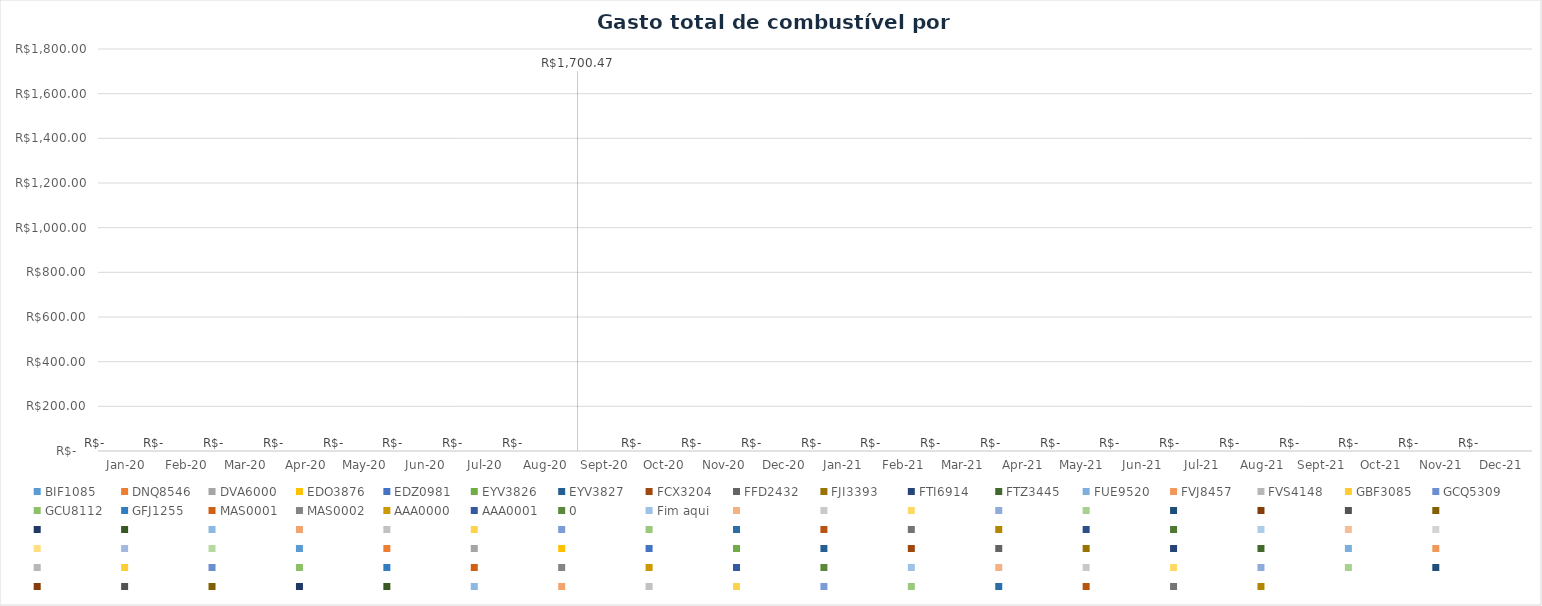
| Category | BIF1085 | DNQ8546 | DVA6000 | EDO3876 | EDZ0981 | EYV3826 | EYV3827 | FCX3204 | FFD2432 | FJI3393 | FTI6914 | FTZ3445 | FUE9520 | FVJ8457 | FVS4148 | GBF3085 | GCQ5309 | GCU8112 | GFJ1255 | MAS0001 | MAS0002 | AAA0000 | AAA0001 | 0 | Fim aqui | Series 25 | Series 26 | Series 27 | Series 28 | Series 29 | Series 30 | Series 31 | Series 32 | Series 33 | Series 34 | Series 35 | Series 36 | Series 37 | Series 38 | Series 39 | Series 40 | Series 41 | Series 42 | Series 43 | Series 44 | Series 45 | Series 46 | Series 47 | Series 48 | Series 49 | Series 50 | Series 51 | Series 52 | Series 53 | Series 54 | Series 55 | Series 56 | Series 57 | Series 58 | Series 59 | Series 60 | Series 61 | Series 62 | Series 63 | Series 64 | Series 65 | Series 66 | Series 67 | Series 68 | Series 69 | Series 70 | Series 71 | Series 72 | Series 73 | Series 74 | Series 75 | Series 76 | Series 77 | Series 78 | Series 79 | Series 80 | Series 81 | Series 82 | Series 83 | Series 84 | Series 85 | Series 86 | Series 87 | Series 88 | Series 89 | Series 90 | Series 91 | Series 92 | Series 93 | Series 94 | Series 95 | Series 96 | Series 97 | Series 98 | Series 99 |
|---|---|---|---|---|---|---|---|---|---|---|---|---|---|---|---|---|---|---|---|---|---|---|---|---|---|---|---|---|---|---|---|---|---|---|---|---|---|---|---|---|---|---|---|---|---|---|---|---|---|---|---|---|---|---|---|---|---|---|---|---|---|---|---|---|---|---|---|---|---|---|---|---|---|---|---|---|---|---|---|---|---|---|---|---|---|---|---|---|---|---|---|---|---|---|---|---|---|---|---|---|
| 2020-01-01 | 0 | 0 | 0 | 0 | 0 | 0 | 0 | 0 | 0 | 0 | 0 | 0 | 0 | 0 | 0 | 0 | 0 | 0 | 0 | 0 | 0 | 0 | 0 | 0 | 0 | 0 | 0 | 0 | 0 | 0 | 0 | 0 | 0 | 0 | 0 | 0 | 0 | 0 | 0 | 0 | 0 | 0 | 0 | 0 | 0 | 0 | 0 | 0 | 0 | 0 | 0 | 0 | 0 | 0 | 0 | 0 | 0 | 0 | 0 | 0 | 0 | 0 | 0 | 0 | 0 | 0 | 0 | 0 | 0 | 0 | 0 | 0 | 0 | 0 | 0 | 0 | 0 | 0 | 0 | 0 | 0 | 0 | 0 | 0 | 0 | 0 | 0 | 0 | 0 | 0 | 0 | 0 | 0 | 0 | 0 | 0 | 0 | 0 | 0 | 0 |
| 2020-02-01 | 0 | 0 | 0 | 0 | 0 | 0 | 0 | 0 | 0 | 0 | 0 | 0 | 0 | 0 | 0 | 0 | 0 | 0 | 0 | 0 | 0 | 0 | 0 | 0 | 0 | 0 | 0 | 0 | 0 | 0 | 0 | 0 | 0 | 0 | 0 | 0 | 0 | 0 | 0 | 0 | 0 | 0 | 0 | 0 | 0 | 0 | 0 | 0 | 0 | 0 | 0 | 0 | 0 | 0 | 0 | 0 | 0 | 0 | 0 | 0 | 0 | 0 | 0 | 0 | 0 | 0 | 0 | 0 | 0 | 0 | 0 | 0 | 0 | 0 | 0 | 0 | 0 | 0 | 0 | 0 | 0 | 0 | 0 | 0 | 0 | 0 | 0 | 0 | 0 | 0 | 0 | 0 | 0 | 0 | 0 | 0 | 0 | 0 | 0 | 0 |
| 2020-03-01 | 0 | 0 | 0 | 0 | 0 | 0 | 0 | 0 | 0 | 0 | 0 | 0 | 0 | 0 | 0 | 0 | 0 | 0 | 0 | 0 | 0 | 0 | 0 | 0 | 0 | 0 | 0 | 0 | 0 | 0 | 0 | 0 | 0 | 0 | 0 | 0 | 0 | 0 | 0 | 0 | 0 | 0 | 0 | 0 | 0 | 0 | 0 | 0 | 0 | 0 | 0 | 0 | 0 | 0 | 0 | 0 | 0 | 0 | 0 | 0 | 0 | 0 | 0 | 0 | 0 | 0 | 0 | 0 | 0 | 0 | 0 | 0 | 0 | 0 | 0 | 0 | 0 | 0 | 0 | 0 | 0 | 0 | 0 | 0 | 0 | 0 | 0 | 0 | 0 | 0 | 0 | 0 | 0 | 0 | 0 | 0 | 0 | 0 | 0 | 0 |
| 2020-04-01 | 0 | 0 | 0 | 0 | 0 | 0 | 0 | 0 | 0 | 0 | 0 | 0 | 0 | 0 | 0 | 0 | 0 | 0 | 0 | 0 | 0 | 0 | 0 | 0 | 0 | 0 | 0 | 0 | 0 | 0 | 0 | 0 | 0 | 0 | 0 | 0 | 0 | 0 | 0 | 0 | 0 | 0 | 0 | 0 | 0 | 0 | 0 | 0 | 0 | 0 | 0 | 0 | 0 | 0 | 0 | 0 | 0 | 0 | 0 | 0 | 0 | 0 | 0 | 0 | 0 | 0 | 0 | 0 | 0 | 0 | 0 | 0 | 0 | 0 | 0 | 0 | 0 | 0 | 0 | 0 | 0 | 0 | 0 | 0 | 0 | 0 | 0 | 0 | 0 | 0 | 0 | 0 | 0 | 0 | 0 | 0 | 0 | 0 | 0 | 0 |
| 2020-05-01 | 0 | 0 | 0 | 0 | 0 | 0 | 0 | 0 | 0 | 0 | 0 | 0 | 0 | 0 | 0 | 0 | 0 | 0 | 0 | 0 | 0 | 0 | 0 | 0 | 0 | 0 | 0 | 0 | 0 | 0 | 0 | 0 | 0 | 0 | 0 | 0 | 0 | 0 | 0 | 0 | 0 | 0 | 0 | 0 | 0 | 0 | 0 | 0 | 0 | 0 | 0 | 0 | 0 | 0 | 0 | 0 | 0 | 0 | 0 | 0 | 0 | 0 | 0 | 0 | 0 | 0 | 0 | 0 | 0 | 0 | 0 | 0 | 0 | 0 | 0 | 0 | 0 | 0 | 0 | 0 | 0 | 0 | 0 | 0 | 0 | 0 | 0 | 0 | 0 | 0 | 0 | 0 | 0 | 0 | 0 | 0 | 0 | 0 | 0 | 0 |
| 2020-06-01 | 0 | 0 | 0 | 0 | 0 | 0 | 0 | 0 | 0 | 0 | 0 | 0 | 0 | 0 | 0 | 0 | 0 | 0 | 0 | 0 | 0 | 0 | 0 | 0 | 0 | 0 | 0 | 0 | 0 | 0 | 0 | 0 | 0 | 0 | 0 | 0 | 0 | 0 | 0 | 0 | 0 | 0 | 0 | 0 | 0 | 0 | 0 | 0 | 0 | 0 | 0 | 0 | 0 | 0 | 0 | 0 | 0 | 0 | 0 | 0 | 0 | 0 | 0 | 0 | 0 | 0 | 0 | 0 | 0 | 0 | 0 | 0 | 0 | 0 | 0 | 0 | 0 | 0 | 0 | 0 | 0 | 0 | 0 | 0 | 0 | 0 | 0 | 0 | 0 | 0 | 0 | 0 | 0 | 0 | 0 | 0 | 0 | 0 | 0 | 0 |
| 2020-07-01 | 0 | 0 | 0 | 0 | 0 | 0 | 0 | 0 | 0 | 0 | 0 | 0 | 0 | 0 | 0 | 0 | 0 | 0 | 0 | 0 | 0 | 0 | 0 | 0 | 0 | 0 | 0 | 0 | 0 | 0 | 0 | 0 | 0 | 0 | 0 | 0 | 0 | 0 | 0 | 0 | 0 | 0 | 0 | 0 | 0 | 0 | 0 | 0 | 0 | 0 | 0 | 0 | 0 | 0 | 0 | 0 | 0 | 0 | 0 | 0 | 0 | 0 | 0 | 0 | 0 | 0 | 0 | 0 | 0 | 0 | 0 | 0 | 0 | 0 | 0 | 0 | 0 | 0 | 0 | 0 | 0 | 0 | 0 | 0 | 0 | 0 | 0 | 0 | 0 | 0 | 0 | 0 | 0 | 0 | 0 | 0 | 0 | 0 | 0 | 0 |
| 2020-08-01 | 0 | 0 | 0 | 0 | 0 | 0 | 0 | 0 | 0 | 0 | 0 | 0 | 0 | 0 | 0 | 0 | 0 | 0 | 0 | 0 | 0 | 0 | 0 | 0 | 0 | 0 | 0 | 0 | 0 | 0 | 0 | 0 | 0 | 0 | 0 | 0 | 0 | 0 | 0 | 0 | 0 | 0 | 0 | 0 | 0 | 0 | 0 | 0 | 0 | 0 | 0 | 0 | 0 | 0 | 0 | 0 | 0 | 0 | 0 | 0 | 0 | 0 | 0 | 0 | 0 | 0 | 0 | 0 | 0 | 0 | 0 | 0 | 0 | 0 | 0 | 0 | 0 | 0 | 0 | 0 | 0 | 0 | 0 | 0 | 0 | 0 | 0 | 0 | 0 | 0 | 0 | 0 | 0 | 0 | 0 | 0 | 0 | 0 | 0 | 0 |
| 2020-09-01 | 1700.47 | 0 | 0 | 0 | 0 | 0 | 0 | 0 | 0 | 0 | 0 | 0 | 0 | 0 | 0 | 0 | 0 | 0 | 0 | 0 | 0 | 0 | 0 | 0 | 0 | 0 | 0 | 0 | 0 | 0 | 0 | 0 | 0 | 0 | 0 | 0 | 0 | 0 | 0 | 0 | 0 | 0 | 0 | 0 | 0 | 0 | 0 | 0 | 0 | 0 | 0 | 0 | 0 | 0 | 0 | 0 | 0 | 0 | 0 | 0 | 0 | 0 | 0 | 0 | 0 | 0 | 0 | 0 | 0 | 0 | 0 | 0 | 0 | 0 | 0 | 0 | 0 | 0 | 0 | 0 | 0 | 0 | 0 | 0 | 0 | 0 | 0 | 0 | 0 | 0 | 0 | 0 | 0 | 0 | 0 | 0 | 0 | 0 | 0 | 0 |
| 2020-10-01 | 0 | 0 | 0 | 0 | 0 | 0 | 0 | 0 | 0 | 0 | 0 | 0 | 0 | 0 | 0 | 0 | 0 | 0 | 0 | 0 | 0 | 0 | 0 | 0 | 0 | 0 | 0 | 0 | 0 | 0 | 0 | 0 | 0 | 0 | 0 | 0 | 0 | 0 | 0 | 0 | 0 | 0 | 0 | 0 | 0 | 0 | 0 | 0 | 0 | 0 | 0 | 0 | 0 | 0 | 0 | 0 | 0 | 0 | 0 | 0 | 0 | 0 | 0 | 0 | 0 | 0 | 0 | 0 | 0 | 0 | 0 | 0 | 0 | 0 | 0 | 0 | 0 | 0 | 0 | 0 | 0 | 0 | 0 | 0 | 0 | 0 | 0 | 0 | 0 | 0 | 0 | 0 | 0 | 0 | 0 | 0 | 0 | 0 | 0 | 0 |
| 2020-11-01 | 0 | 0 | 0 | 0 | 0 | 0 | 0 | 0 | 0 | 0 | 0 | 0 | 0 | 0 | 0 | 0 | 0 | 0 | 0 | 0 | 0 | 0 | 0 | 0 | 0 | 0 | 0 | 0 | 0 | 0 | 0 | 0 | 0 | 0 | 0 | 0 | 0 | 0 | 0 | 0 | 0 | 0 | 0 | 0 | 0 | 0 | 0 | 0 | 0 | 0 | 0 | 0 | 0 | 0 | 0 | 0 | 0 | 0 | 0 | 0 | 0 | 0 | 0 | 0 | 0 | 0 | 0 | 0 | 0 | 0 | 0 | 0 | 0 | 0 | 0 | 0 | 0 | 0 | 0 | 0 | 0 | 0 | 0 | 0 | 0 | 0 | 0 | 0 | 0 | 0 | 0 | 0 | 0 | 0 | 0 | 0 | 0 | 0 | 0 | 0 |
| 2020-12-01 | 0 | 0 | 0 | 0 | 0 | 0 | 0 | 0 | 0 | 0 | 0 | 0 | 0 | 0 | 0 | 0 | 0 | 0 | 0 | 0 | 0 | 0 | 0 | 0 | 0 | 0 | 0 | 0 | 0 | 0 | 0 | 0 | 0 | 0 | 0 | 0 | 0 | 0 | 0 | 0 | 0 | 0 | 0 | 0 | 0 | 0 | 0 | 0 | 0 | 0 | 0 | 0 | 0 | 0 | 0 | 0 | 0 | 0 | 0 | 0 | 0 | 0 | 0 | 0 | 0 | 0 | 0 | 0 | 0 | 0 | 0 | 0 | 0 | 0 | 0 | 0 | 0 | 0 | 0 | 0 | 0 | 0 | 0 | 0 | 0 | 0 | 0 | 0 | 0 | 0 | 0 | 0 | 0 | 0 | 0 | 0 | 0 | 0 | 0 | 0 |
| 2021-01-01 | 0 | 0 | 0 | 0 | 0 | 0 | 0 | 0 | 0 | 0 | 0 | 0 | 0 | 0 | 0 | 0 | 0 | 0 | 0 | 0 | 0 | 0 | 0 | 0 | 0 | 0 | 0 | 0 | 0 | 0 | 0 | 0 | 0 | 0 | 0 | 0 | 0 | 0 | 0 | 0 | 0 | 0 | 0 | 0 | 0 | 0 | 0 | 0 | 0 | 0 | 0 | 0 | 0 | 0 | 0 | 0 | 0 | 0 | 0 | 0 | 0 | 0 | 0 | 0 | 0 | 0 | 0 | 0 | 0 | 0 | 0 | 0 | 0 | 0 | 0 | 0 | 0 | 0 | 0 | 0 | 0 | 0 | 0 | 0 | 0 | 0 | 0 | 0 | 0 | 0 | 0 | 0 | 0 | 0 | 0 | 0 | 0 | 0 | 0 | 0 |
| 2021-02-01 | 0 | 0 | 0 | 0 | 0 | 0 | 0 | 0 | 0 | 0 | 0 | 0 | 0 | 0 | 0 | 0 | 0 | 0 | 0 | 0 | 0 | 0 | 0 | 0 | 0 | 0 | 0 | 0 | 0 | 0 | 0 | 0 | 0 | 0 | 0 | 0 | 0 | 0 | 0 | 0 | 0 | 0 | 0 | 0 | 0 | 0 | 0 | 0 | 0 | 0 | 0 | 0 | 0 | 0 | 0 | 0 | 0 | 0 | 0 | 0 | 0 | 0 | 0 | 0 | 0 | 0 | 0 | 0 | 0 | 0 | 0 | 0 | 0 | 0 | 0 | 0 | 0 | 0 | 0 | 0 | 0 | 0 | 0 | 0 | 0 | 0 | 0 | 0 | 0 | 0 | 0 | 0 | 0 | 0 | 0 | 0 | 0 | 0 | 0 | 0 |
| 2021-03-01 | 0 | 0 | 0 | 0 | 0 | 0 | 0 | 0 | 0 | 0 | 0 | 0 | 0 | 0 | 0 | 0 | 0 | 0 | 0 | 0 | 0 | 0 | 0 | 0 | 0 | 0 | 0 | 0 | 0 | 0 | 0 | 0 | 0 | 0 | 0 | 0 | 0 | 0 | 0 | 0 | 0 | 0 | 0 | 0 | 0 | 0 | 0 | 0 | 0 | 0 | 0 | 0 | 0 | 0 | 0 | 0 | 0 | 0 | 0 | 0 | 0 | 0 | 0 | 0 | 0 | 0 | 0 | 0 | 0 | 0 | 0 | 0 | 0 | 0 | 0 | 0 | 0 | 0 | 0 | 0 | 0 | 0 | 0 | 0 | 0 | 0 | 0 | 0 | 0 | 0 | 0 | 0 | 0 | 0 | 0 | 0 | 0 | 0 | 0 | 0 |
| 2021-04-01 | 0 | 0 | 0 | 0 | 0 | 0 | 0 | 0 | 0 | 0 | 0 | 0 | 0 | 0 | 0 | 0 | 0 | 0 | 0 | 0 | 0 | 0 | 0 | 0 | 0 | 0 | 0 | 0 | 0 | 0 | 0 | 0 | 0 | 0 | 0 | 0 | 0 | 0 | 0 | 0 | 0 | 0 | 0 | 0 | 0 | 0 | 0 | 0 | 0 | 0 | 0 | 0 | 0 | 0 | 0 | 0 | 0 | 0 | 0 | 0 | 0 | 0 | 0 | 0 | 0 | 0 | 0 | 0 | 0 | 0 | 0 | 0 | 0 | 0 | 0 | 0 | 0 | 0 | 0 | 0 | 0 | 0 | 0 | 0 | 0 | 0 | 0 | 0 | 0 | 0 | 0 | 0 | 0 | 0 | 0 | 0 | 0 | 0 | 0 | 0 |
| 2021-05-01 | 0 | 0 | 0 | 0 | 0 | 0 | 0 | 0 | 0 | 0 | 0 | 0 | 0 | 0 | 0 | 0 | 0 | 0 | 0 | 0 | 0 | 0 | 0 | 0 | 0 | 0 | 0 | 0 | 0 | 0 | 0 | 0 | 0 | 0 | 0 | 0 | 0 | 0 | 0 | 0 | 0 | 0 | 0 | 0 | 0 | 0 | 0 | 0 | 0 | 0 | 0 | 0 | 0 | 0 | 0 | 0 | 0 | 0 | 0 | 0 | 0 | 0 | 0 | 0 | 0 | 0 | 0 | 0 | 0 | 0 | 0 | 0 | 0 | 0 | 0 | 0 | 0 | 0 | 0 | 0 | 0 | 0 | 0 | 0 | 0 | 0 | 0 | 0 | 0 | 0 | 0 | 0 | 0 | 0 | 0 | 0 | 0 | 0 | 0 | 0 |
| 2021-06-01 | 0 | 0 | 0 | 0 | 0 | 0 | 0 | 0 | 0 | 0 | 0 | 0 | 0 | 0 | 0 | 0 | 0 | 0 | 0 | 0 | 0 | 0 | 0 | 0 | 0 | 0 | 0 | 0 | 0 | 0 | 0 | 0 | 0 | 0 | 0 | 0 | 0 | 0 | 0 | 0 | 0 | 0 | 0 | 0 | 0 | 0 | 0 | 0 | 0 | 0 | 0 | 0 | 0 | 0 | 0 | 0 | 0 | 0 | 0 | 0 | 0 | 0 | 0 | 0 | 0 | 0 | 0 | 0 | 0 | 0 | 0 | 0 | 0 | 0 | 0 | 0 | 0 | 0 | 0 | 0 | 0 | 0 | 0 | 0 | 0 | 0 | 0 | 0 | 0 | 0 | 0 | 0 | 0 | 0 | 0 | 0 | 0 | 0 | 0 | 0 |
| 2021-07-01 | 0 | 0 | 0 | 0 | 0 | 0 | 0 | 0 | 0 | 0 | 0 | 0 | 0 | 0 | 0 | 0 | 0 | 0 | 0 | 0 | 0 | 0 | 0 | 0 | 0 | 0 | 0 | 0 | 0 | 0 | 0 | 0 | 0 | 0 | 0 | 0 | 0 | 0 | 0 | 0 | 0 | 0 | 0 | 0 | 0 | 0 | 0 | 0 | 0 | 0 | 0 | 0 | 0 | 0 | 0 | 0 | 0 | 0 | 0 | 0 | 0 | 0 | 0 | 0 | 0 | 0 | 0 | 0 | 0 | 0 | 0 | 0 | 0 | 0 | 0 | 0 | 0 | 0 | 0 | 0 | 0 | 0 | 0 | 0 | 0 | 0 | 0 | 0 | 0 | 0 | 0 | 0 | 0 | 0 | 0 | 0 | 0 | 0 | 0 | 0 |
| 2021-08-01 | 0 | 0 | 0 | 0 | 0 | 0 | 0 | 0 | 0 | 0 | 0 | 0 | 0 | 0 | 0 | 0 | 0 | 0 | 0 | 0 | 0 | 0 | 0 | 0 | 0 | 0 | 0 | 0 | 0 | 0 | 0 | 0 | 0 | 0 | 0 | 0 | 0 | 0 | 0 | 0 | 0 | 0 | 0 | 0 | 0 | 0 | 0 | 0 | 0 | 0 | 0 | 0 | 0 | 0 | 0 | 0 | 0 | 0 | 0 | 0 | 0 | 0 | 0 | 0 | 0 | 0 | 0 | 0 | 0 | 0 | 0 | 0 | 0 | 0 | 0 | 0 | 0 | 0 | 0 | 0 | 0 | 0 | 0 | 0 | 0 | 0 | 0 | 0 | 0 | 0 | 0 | 0 | 0 | 0 | 0 | 0 | 0 | 0 | 0 | 0 |
| 2021-09-01 | 0 | 0 | 0 | 0 | 0 | 0 | 0 | 0 | 0 | 0 | 0 | 0 | 0 | 0 | 0 | 0 | 0 | 0 | 0 | 0 | 0 | 0 | 0 | 0 | 0 | 0 | 0 | 0 | 0 | 0 | 0 | 0 | 0 | 0 | 0 | 0 | 0 | 0 | 0 | 0 | 0 | 0 | 0 | 0 | 0 | 0 | 0 | 0 | 0 | 0 | 0 | 0 | 0 | 0 | 0 | 0 | 0 | 0 | 0 | 0 | 0 | 0 | 0 | 0 | 0 | 0 | 0 | 0 | 0 | 0 | 0 | 0 | 0 | 0 | 0 | 0 | 0 | 0 | 0 | 0 | 0 | 0 | 0 | 0 | 0 | 0 | 0 | 0 | 0 | 0 | 0 | 0 | 0 | 0 | 0 | 0 | 0 | 0 | 0 | 0 |
| 2021-10-01 | 0 | 0 | 0 | 0 | 0 | 0 | 0 | 0 | 0 | 0 | 0 | 0 | 0 | 0 | 0 | 0 | 0 | 0 | 0 | 0 | 0 | 0 | 0 | 0 | 0 | 0 | 0 | 0 | 0 | 0 | 0 | 0 | 0 | 0 | 0 | 0 | 0 | 0 | 0 | 0 | 0 | 0 | 0 | 0 | 0 | 0 | 0 | 0 | 0 | 0 | 0 | 0 | 0 | 0 | 0 | 0 | 0 | 0 | 0 | 0 | 0 | 0 | 0 | 0 | 0 | 0 | 0 | 0 | 0 | 0 | 0 | 0 | 0 | 0 | 0 | 0 | 0 | 0 | 0 | 0 | 0 | 0 | 0 | 0 | 0 | 0 | 0 | 0 | 0 | 0 | 0 | 0 | 0 | 0 | 0 | 0 | 0 | 0 | 0 | 0 |
| 2021-11-01 | 0 | 0 | 0 | 0 | 0 | 0 | 0 | 0 | 0 | 0 | 0 | 0 | 0 | 0 | 0 | 0 | 0 | 0 | 0 | 0 | 0 | 0 | 0 | 0 | 0 | 0 | 0 | 0 | 0 | 0 | 0 | 0 | 0 | 0 | 0 | 0 | 0 | 0 | 0 | 0 | 0 | 0 | 0 | 0 | 0 | 0 | 0 | 0 | 0 | 0 | 0 | 0 | 0 | 0 | 0 | 0 | 0 | 0 | 0 | 0 | 0 | 0 | 0 | 0 | 0 | 0 | 0 | 0 | 0 | 0 | 0 | 0 | 0 | 0 | 0 | 0 | 0 | 0 | 0 | 0 | 0 | 0 | 0 | 0 | 0 | 0 | 0 | 0 | 0 | 0 | 0 | 0 | 0 | 0 | 0 | 0 | 0 | 0 | 0 | 0 |
| 2021-12-01 | 0 | 0 | 0 | 0 | 0 | 0 | 0 | 0 | 0 | 0 | 0 | 0 | 0 | 0 | 0 | 0 | 0 | 0 | 0 | 0 | 0 | 0 | 0 | 0 | 0 | 0 | 0 | 0 | 0 | 0 | 0 | 0 | 0 | 0 | 0 | 0 | 0 | 0 | 0 | 0 | 0 | 0 | 0 | 0 | 0 | 0 | 0 | 0 | 0 | 0 | 0 | 0 | 0 | 0 | 0 | 0 | 0 | 0 | 0 | 0 | 0 | 0 | 0 | 0 | 0 | 0 | 0 | 0 | 0 | 0 | 0 | 0 | 0 | 0 | 0 | 0 | 0 | 0 | 0 | 0 | 0 | 0 | 0 | 0 | 0 | 0 | 0 | 0 | 0 | 0 | 0 | 0 | 0 | 0 | 0 | 0 | 0 | 0 | 0 | 0 |